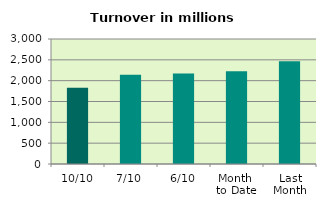
| Category | Series 0 |
|---|---|
| 10/10 | 1829.187 |
| 7/10 | 2143.367 |
| 6/10 | 2170.853 |
| Month 
to Date | 2223.635 |
| Last
Month | 2468.023 |